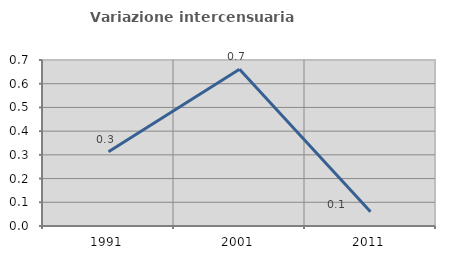
| Category | Variazione intercensuaria annua |
|---|---|
| 1991.0 | 0.313 |
| 2001.0 | 0.661 |
| 2011.0 | 0.061 |